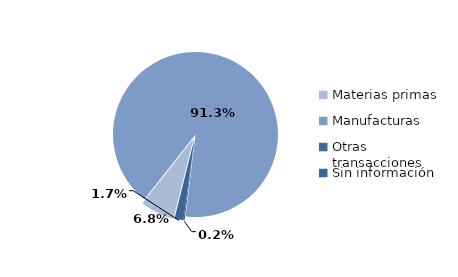
| Category | Series 0 |
|---|---|
| Materias primas | 1618.315 |
| Manufacturas | 21864.326 |
| Otras transacciones | 56.16 |
| Sin información | 418.241 |